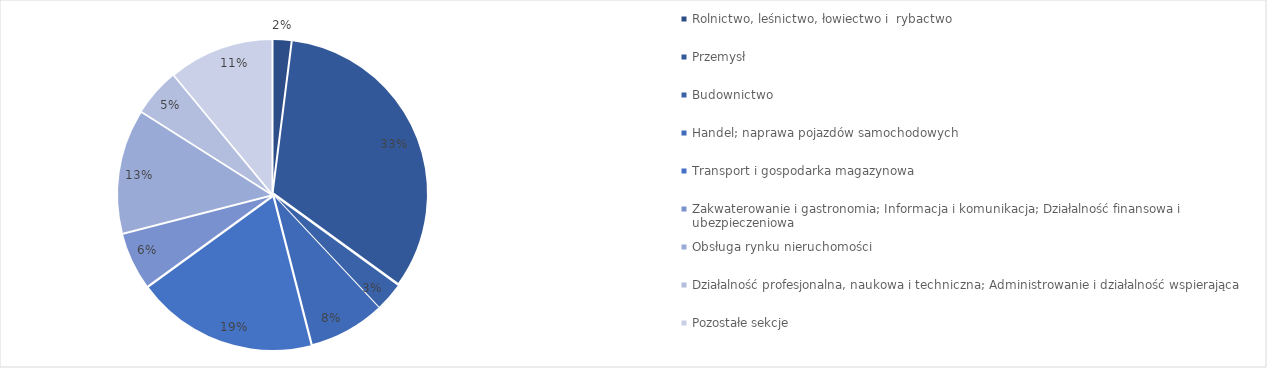
| Category | Series 0 |
|---|---|
| Rolnictwo, leśnictwo, łowiectwo i  rybactwo | 0.02 |
| Przemysł  | 0.33 |
| Budownictwo | 0.03 |
| Handel; naprawa pojazdów samochodowych | 0.08 |
| Transport i gospodarka magazynowa | 0.19 |
| Zakwaterowanie i gastronomia; Informacja i komunikacja; Działalność finansowa i ubezpieczeniowa | 0.06 |
| Obsługa rynku nieruchomości | 0.13 |
| Działalność profesjonalna, naukowa i techniczna; Administrowanie i działalność wspierająca | 0.05 |
| Pozostałe sekcje | 0.11 |